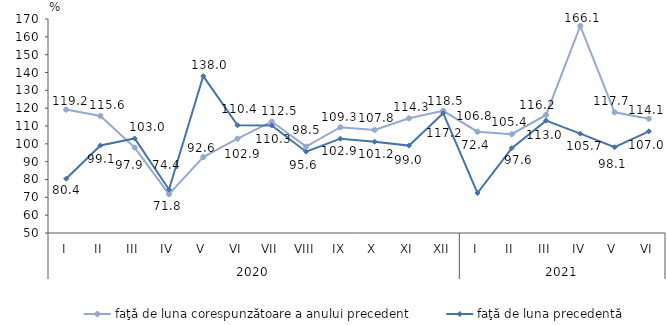
| Category | faţă de luna corespunzătoare a anului precedent | faţă de luna precedentă   |
|---|---|---|
| 0 | 119.2 | 80.4 |
| 1 | 115.6 | 99.1 |
| 2 | 97.9 | 103 |
| 3 | 71.8 | 74.4 |
| 4 | 92.6 | 138 |
| 5 | 102.9 | 110.4 |
| 6 | 112.5 | 110.3 |
| 7 | 98.5 | 95.6 |
| 8 | 109.3 | 102.9 |
| 9 | 107.8 | 101.2 |
| 10 | 114.3 | 99 |
| 11 | 118.5 | 117.2 |
| 12 | 106.8 | 72.4 |
| 13 | 105.4 | 97.6 |
| 14 | 116.2 | 113 |
| 15 | 166.1 | 105.7 |
| 16 | 117.7 | 98.1 |
| 17 | 114.1 | 107 |